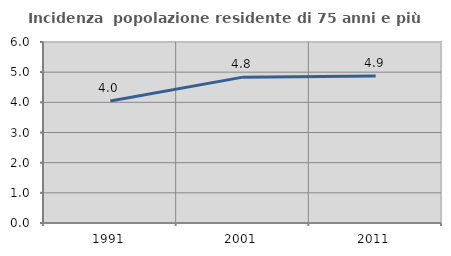
| Category | Incidenza  popolazione residente di 75 anni e più |
|---|---|
| 1991.0 | 4.046 |
| 2001.0 | 4.835 |
| 2011.0 | 4.873 |